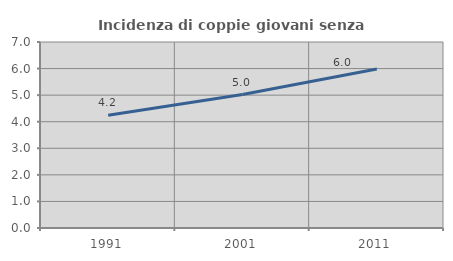
| Category | Incidenza di coppie giovani senza figli |
|---|---|
| 1991.0 | 4.244 |
| 2001.0 | 5.021 |
| 2011.0 | 5.983 |